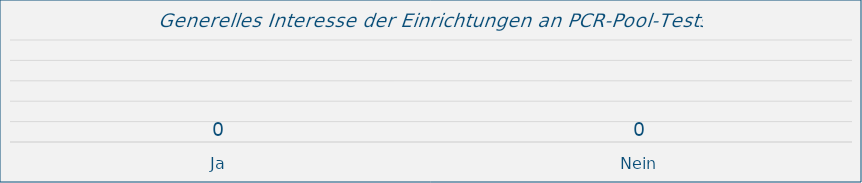
| Category | Series 0 |
|---|---|
| Ja | 0 |
| Nein | 0 |